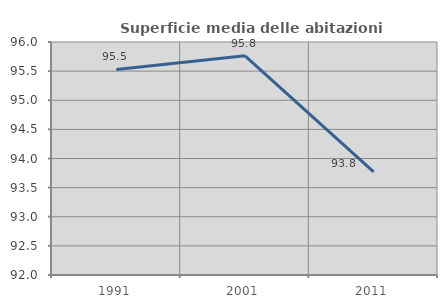
| Category | Superficie media delle abitazioni occupate |
|---|---|
| 1991.0 | 95.53 |
| 2001.0 | 95.762 |
| 2011.0 | 93.77 |